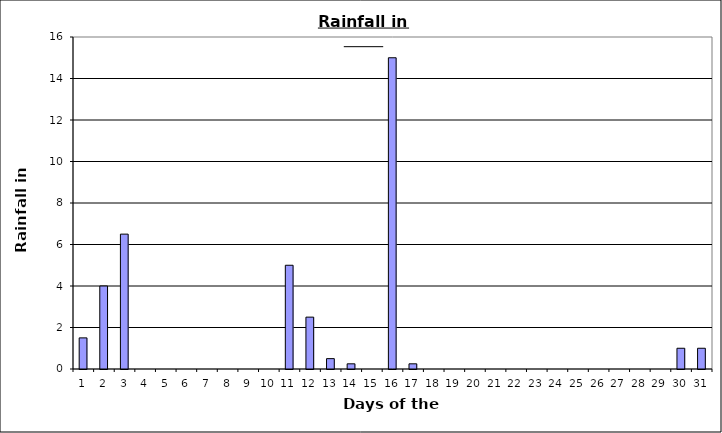
| Category | Series 0 |
|---|---|
| 0 | 1.5 |
| 1 | 4 |
| 2 | 6.5 |
| 3 | 0 |
| 4 | 0 |
| 5 | 0 |
| 6 | 0 |
| 7 | 0 |
| 8 | 0 |
| 9 | 0 |
| 10 | 5 |
| 11 | 2.5 |
| 12 | 0.5 |
| 13 | 0.25 |
| 14 | 0 |
| 15 | 15 |
| 16 | 0.25 |
| 17 | 0 |
| 18 | 0 |
| 19 | 0 |
| 20 | 0 |
| 21 | 0 |
| 22 | 0 |
| 23 | 0 |
| 24 | 0 |
| 25 | 0 |
| 26 | 0 |
| 27 | 0 |
| 28 | 0 |
| 29 | 1 |
| 30 | 1 |